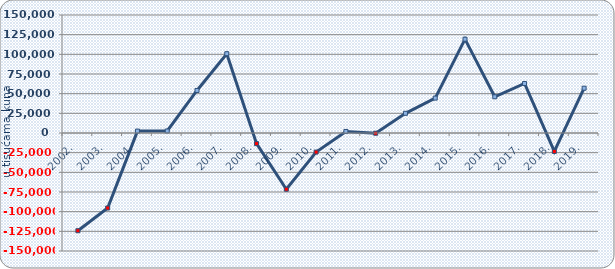
| Category | Neto dobit/gubitak |
|---|---|
| 2002. | -124231 |
| 2003. | -95344.036 |
| 2004. | 2436.128 |
| 2005. | 2570.111 |
| 2006. | 54067.607 |
| 2007. | 100801.461 |
| 2008. | -13516.351 |
| 2009. | -71435.126 |
| 2010. | -24239.572 |
| 2011. | 1954.712 |
| 2012. | -299.182 |
| 2013. | 25029.006 |
| 2014. | 44359.392 |
| 2015. | 119271.921 |
| 2016. | 46028.074 |
| 2017. | 62930.867 |
| 2018. | -23428 |
| 2019. | 56936 |